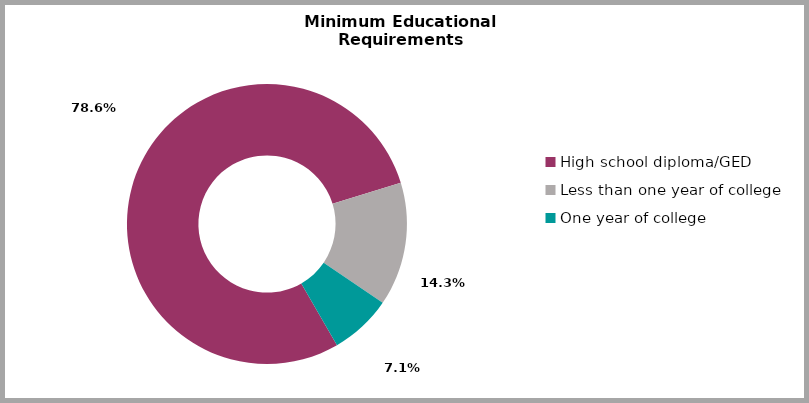
| Category | Series 0 |
|---|---|
| High school diploma/GED | 11 |
| Less than one year of college | 2 |
| One year of college | 1 |